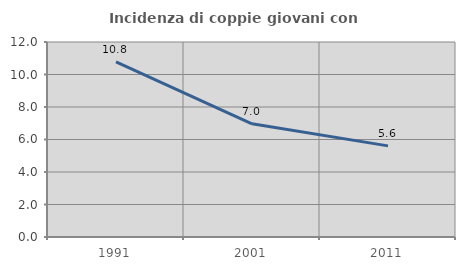
| Category | Incidenza di coppie giovani con figli |
|---|---|
| 1991.0 | 10.772 |
| 2001.0 | 6.969 |
| 2011.0 | 5.607 |